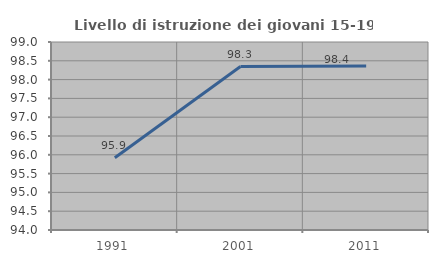
| Category | Livello di istruzione dei giovani 15-19 anni |
|---|---|
| 1991.0 | 95.92 |
| 2001.0 | 98.347 |
| 2011.0 | 98.361 |